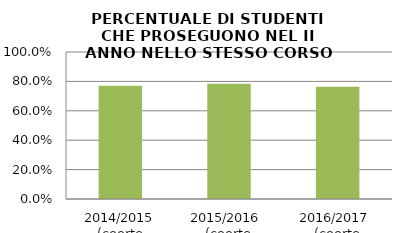
| Category | 2014/2015 (coorte 2013/14) 2015/2016  (coorte 2014/15) 2016/2017  (coorte 2015/16) |
|---|---|
| 2014/2015 (coorte 2013/14) | 0.771 |
| 2015/2016  (coorte 2014/15) | 0.784 |
| 2016/2017  (coorte 2015/16) | 0.763 |